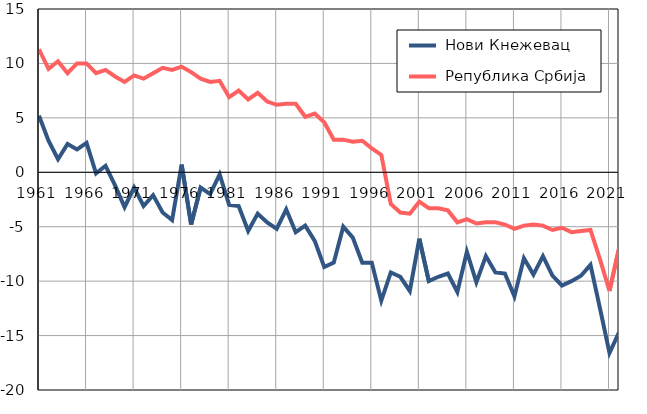
| Category |  Нови Кнежевац |  Република Србија |
|---|---|---|
| 1961.0 | 5.2 | 11.3 |
| 1962.0 | 2.9 | 9.5 |
| 1963.0 | 1.2 | 10.2 |
| 1964.0 | 2.6 | 9.1 |
| 1965.0 | 2.1 | 10 |
| 1966.0 | 2.7 | 10 |
| 1967.0 | -0.1 | 9.1 |
| 1968.0 | 0.6 | 9.4 |
| 1969.0 | -1.2 | 8.8 |
| 1970.0 | -3.2 | 8.3 |
| 1971.0 | -1.4 | 8.9 |
| 1972.0 | -3.1 | 8.6 |
| 1973.0 | -2.1 | 9.1 |
| 1974.0 | -3.7 | 9.6 |
| 1975.0 | -4.4 | 9.4 |
| 1976.0 | 0.7 | 9.7 |
| 1977.0 | -4.8 | 9.2 |
| 1978.0 | -1.4 | 8.6 |
| 1979.0 | -2 | 8.3 |
| 1980.0 | -0.2 | 8.4 |
| 1981.0 | -3 | 6.9 |
| 1982.0 | -3.1 | 7.5 |
| 1983.0 | -5.4 | 6.7 |
| 1984.0 | -3.8 | 7.3 |
| 1985.0 | -4.6 | 6.5 |
| 1986.0 | -5.2 | 6.2 |
| 1987.0 | -3.4 | 6.3 |
| 1988.0 | -5.5 | 6.3 |
| 1989.0 | -4.9 | 5.1 |
| 1990.0 | -6.3 | 5.4 |
| 1991.0 | -8.7 | 4.6 |
| 1992.0 | -8.3 | 3 |
| 1993.0 | -5 | 3 |
| 1994.0 | -6 | 2.8 |
| 1995.0 | -8.3 | 2.9 |
| 1996.0 | -8.3 | 2.2 |
| 1997.0 | -11.8 | 1.6 |
| 1998.0 | -9.2 | -2.9 |
| 1999.0 | -9.6 | -3.7 |
| 2000.0 | -10.9 | -3.8 |
| 2001.0 | -6.1 | -2.7 |
| 2002.0 | -10 | -3.3 |
| 2003.0 | -9.6 | -3.3 |
| 2004.0 | -9.3 | -3.5 |
| 2005.0 | -11 | -4.6 |
| 2006.0 | -7.3 | -4.3 |
| 2007.0 | -10.1 | -4.7 |
| 2008.0 | -7.7 | -4.6 |
| 2009.0 | -9.2 | -4.6 |
| 2010.0 | -9.3 | -4.8 |
| 2011.0 | -11.4 | -5.2 |
| 2012.0 | -7.9 | -4.9 |
| 2013.0 | -9.4 | -4.8 |
| 2014.0 | -7.7 | -4.9 |
| 2015.0 | -9.5 | -5.3 |
| 2016.0 | -10.4 | -5.1 |
| 2017.0 | -10 | -5.5 |
| 2018.0 | -9.5 | -5.4 |
| 2019.0 | -8.5 | -5.3 |
| 2020.0 | -12.5 | -8 |
| 2021.0 | -16.6 | -10.9 |
| 2022.0 | -14.7 | -7 |